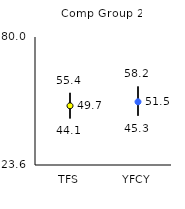
| Category | 25th | 75th | Mean |
|---|---|---|---|
| TFS | 44.1 | 55.4 | 49.68 |
| YFCY | 45.3 | 58.2 | 51.45 |